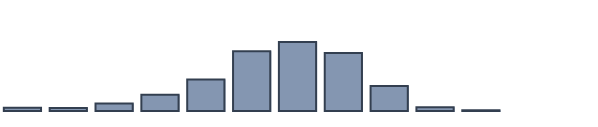
| Category | Series 0 |
|---|---|
| 0 | 1.136 |
| 1 | 1.061 |
| 2 | 2.727 |
| 3 | 5.833 |
| 4 | 11.364 |
| 5 | 21.515 |
| 6 | 24.848 |
| 7 | 20.909 |
| 8 | 9.015 |
| 9 | 1.364 |
| 10 | 0.227 |
| 11 | 0 |
| 12 | 0 |